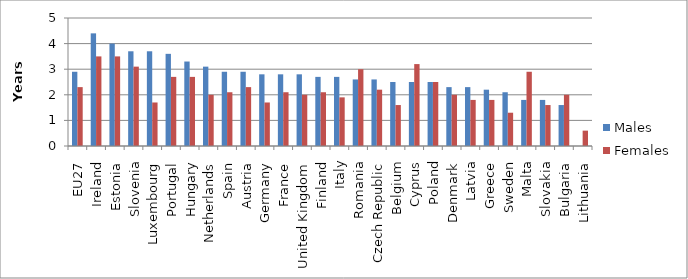
| Category | Males | Females |
|---|---|---|
| EU27 | 2.9 | 2.3 |
| Ireland | 4.4 | 3.5 |
| Estonia | 4 | 3.5 |
| Slovenia | 3.7 | 3.1 |
| Luxembourg | 3.7 | 1.7 |
| Portugal | 3.6 | 2.7 |
| Hungary | 3.3 | 2.7 |
| Netherlands | 3.1 | 2 |
| Spain | 2.9 | 2.1 |
| Austria | 2.9 | 2.3 |
| Germany | 2.8 | 1.7 |
| France | 2.8 | 2.1 |
| United Kingdom | 2.8 | 2 |
| Finland | 2.7 | 2.1 |
| Italy | 2.7 | 1.9 |
| Romania | 2.6 | 3 |
| Czech Republic | 2.6 | 2.2 |
| Belgium | 2.5 | 1.6 |
| Cyprus | 2.5 | 3.2 |
| Poland | 2.5 | 2.5 |
| Denmark | 2.3 | 2 |
| Latvia | 2.3 | 1.8 |
| Greece | 2.2 | 1.8 |
| Sweden | 2.1 | 1.3 |
| Malta | 1.8 | 2.9 |
| Slovakia | 1.8 | 1.6 |
| Bulgaria | 1.6 | 2 |
| Lithuania | 0 | 0.6 |